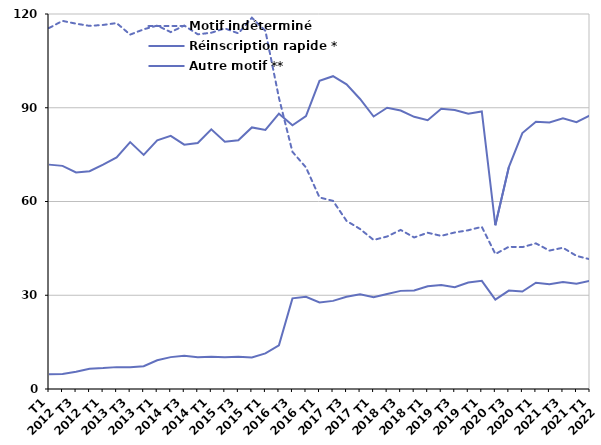
| Category | Motif indéterminé | Réinscription rapide * | Autre motif ** |
|---|---|---|---|
| T1
2012 | 115.5 | 71.8 | 4.7 |
| T2
2012 | 117.8 | 71.4 | 4.8 |
| T3
2012 | 116.9 | 69.3 | 5.5 |
| T4
2012 | 116.2 | 69.7 | 6.5 |
| T1
2013 | 116.5 | 71.8 | 6.7 |
| T2
2013 | 117.1 | 74.1 | 7 |
| T3
2013 | 113.4 | 79 | 7 |
| T4
2013 | 115.1 | 74.9 | 7.3 |
| T1
2014 | 116.3 | 79.6 | 9.2 |
| T2
2014 | 114.2 | 81 | 10.2 |
| T3
2014 | 116.3 | 78.2 | 10.6 |
| T4
2014 | 113.5 | 78.7 | 10.2 |
| T1
2015 | 114 | 83.1 | 10.3 |
| T2
2015 | 115.4 | 79.1 | 10.2 |
| T3
2015 | 113.8 | 79.6 | 10.3 |
| T4
2015 | 118.8 | 83.7 | 10.1 |
| T1
2016 | 114.6 | 82.9 | 11.4 |
| T2
2016 | 93.2 | 88.1 | 14 |
| T3
2016 | 75.9 | 84.4 | 29 |
| T4
2016 | 70.9 | 87.3 | 29.5 |
| T1
2017 | 61.3 | 98.6 | 27.7 |
| T2
2017 | 60.2 | 100.1 | 28.2 |
| T3
2017 | 53.8 | 97.5 | 29.5 |
| T4
2017 | 51.2 | 92.8 | 30.3 |
| T1
2018 | 47.7 | 87.2 | 29.4 |
| T2
2018 | 48.8 | 90 | 30.4 |
| T3
2018 | 50.9 | 89.1 | 31.4 |
| T4
2018 | 48.5 | 87.1 | 31.5 |
| T1
2019 | 50 | 86 | 32.9 |
| T2
2019 | 49 | 89.7 | 33.3 |
| T3
2019 | 50.1 | 89.3 | 32.6 |
| T4
2019 | 50.8 | 88.1 | 34.1 |
| T1
2020 | 51.9 | 88.8 | 34.6 |
| T2
2020 | 43.2 | 52.4 | 28.6 |
| T3
2020 | 45.5 | 71 | 31.5 |
| T4
2020 | 45.4 | 81.9 | 31.2 |
| T1
2021 | 46.6 | 85.5 | 34 |
| T2
2021 | 44.3 | 85.3 | 33.5 |
| T3
2021 | 45.2 | 86.6 | 34.2 |
| T4
2021 | 42.6 | 85.4 | 33.7 |
| T1
2022 | 41.5 | 87.6 | 34.6 |